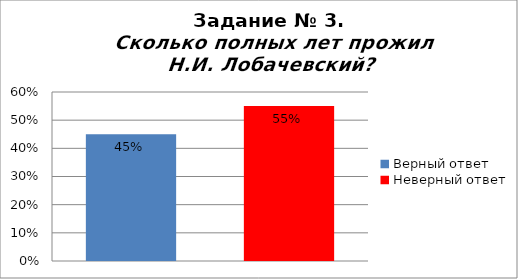
| Category | Сколько полных лет прожил Н.И. Лобачевский? |
|---|---|
| Верный ответ | 0.45 |
| Неверный ответ | 0.55 |